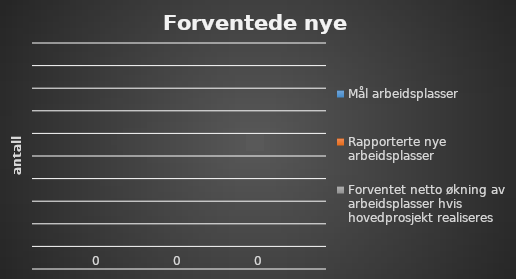
| Category | Mål arbeidsplasser | Rapporterte nye arbeidsplasser | Forventet netto økning av arbeidsplasser hvis hovedprosjekt realiseres |
|---|---|---|---|
| 0 | 0 | 0 | 0 |